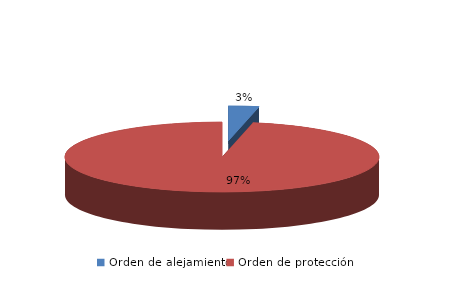
| Category | Series 0 |
|---|---|
| Orden de alejamiento | 5 |
| Orden de protección | 154 |